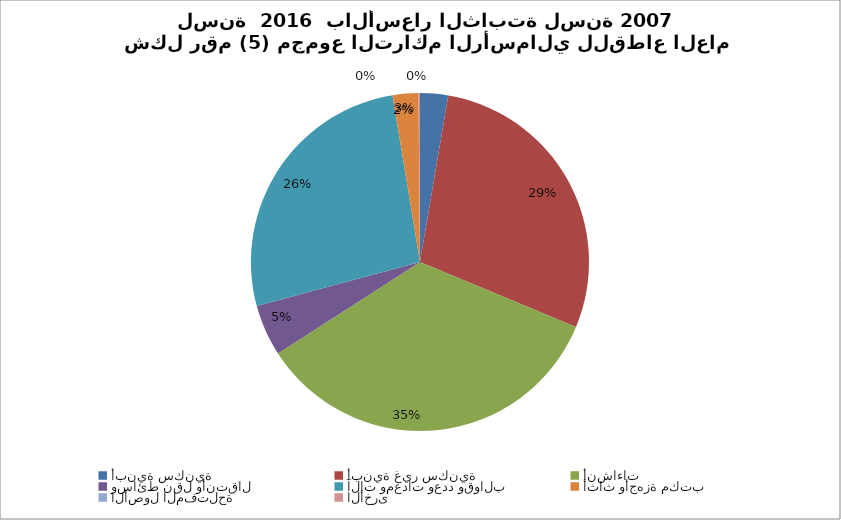
| Category | Series 0 |
|---|---|
| أبنية سكنية | 4915.837 |
| أبنية غير سكنية | 52524.486 |
| أنشاءات | 63537.065 |
| وسائط نقل وأنتقال | 9047.075 |
| آلات ومعدات وعدد وقوالب | 48828.817 |
| أثاث وأجهزة مكتب | 4520.655 |
| الأصول المفتلحة | 15.154 |
| الأخرى  | 241.674 |